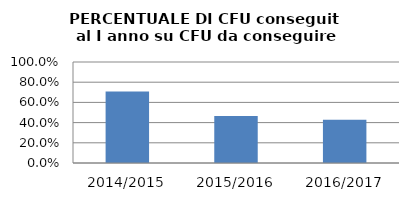
| Category | 2014/2015 2015/2016 2016/2017 |
|---|---|
| 2014/2015 | 0.707 |
| 2015/2016 | 0.465 |
| 2016/2017 | 0.427 |